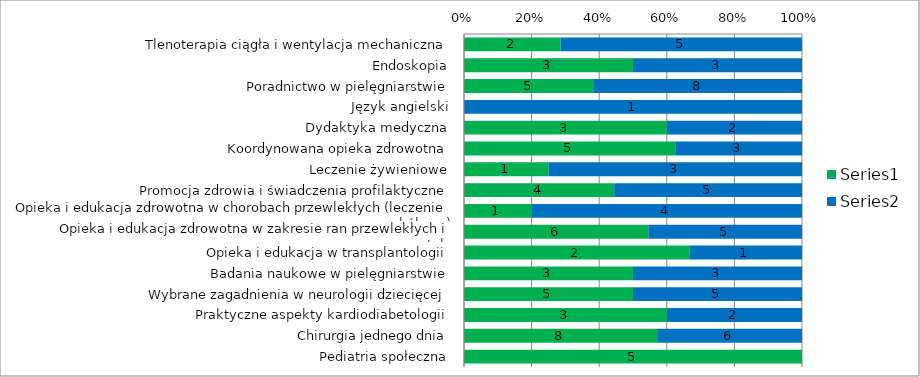
| Category | Series 0 | Series 1 |
|---|---|---|
| Tlenoterapia ciągła i wentylacja mechaniczna | 2 | 5 |
| Endoskopia | 3 | 3 |
| Poradnictwo w pielęgniarstwie | 5 | 8 |
| Język angielski | 0 | 1 |
| Dydaktyka medyczna | 3 | 2 |
| Koordynowana opieka zdrowotna | 5 | 3 |
| Leczenie żywieniowe | 1 | 3 |
| Promocja zdrowia i świadczenia profilaktyczne | 4 | 5 |
| Opieka i edukacja zdrowotna w chorobach przewlekłych (leczenie p. bólowe) | 1 | 4 |
| Opieka i edukacja zdrowotna w zakresie ran przewlekłych i przetok  | 6 | 5 |
| Opieka i edukacja w transplantologii | 2 | 1 |
| Badania naukowe w pielęgniarstwie | 3 | 3 |
| Wybrane zagadnienia w neurologii dziecięcej | 5 | 5 |
| Praktyczne aspekty kardiodiabetologii | 3 | 2 |
| Chirurgia jednego dnia | 8 | 6 |
| Pediatria społeczna | 5 | 0 |